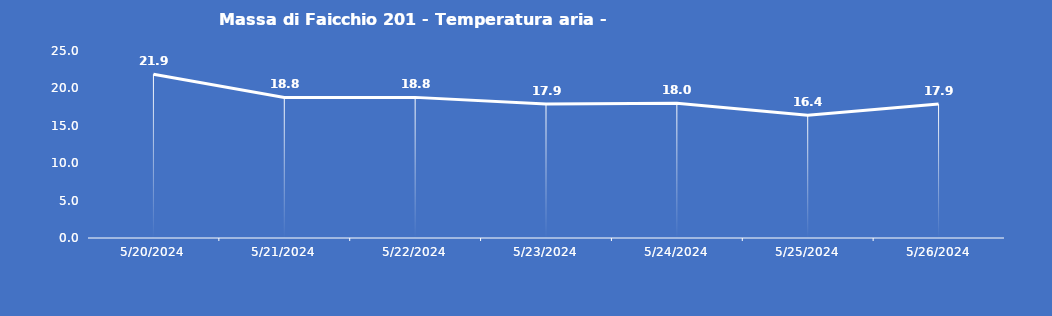
| Category | Massa di Faicchio 201 - Temperatura aria - Grezzo (°C) |
|---|---|
| 5/20/24 | 21.9 |
| 5/21/24 | 18.8 |
| 5/22/24 | 18.8 |
| 5/23/24 | 17.9 |
| 5/24/24 | 18 |
| 5/25/24 | 16.4 |
| 5/26/24 | 17.9 |